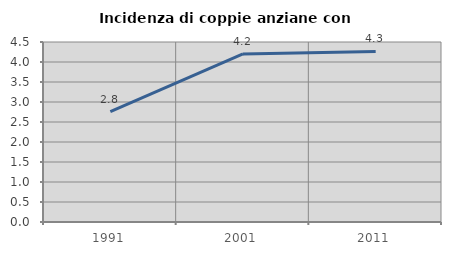
| Category | Incidenza di coppie anziane con figli |
|---|---|
| 1991.0 | 2.757 |
| 2001.0 | 4.202 |
| 2011.0 | 4.263 |